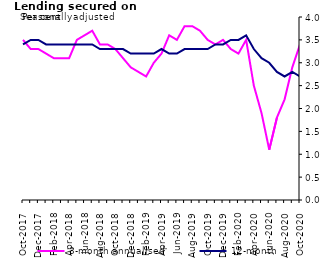
| Category | 3-month annualised | 12-month |
|---|---|---|
| Oct-2017 | 3.5 | 3.4 |
| Nov-2017 | 3.3 | 3.5 |
| Dec-2017 | 3.3 | 3.5 |
| Jan-2018 | 3.2 | 3.4 |
| Feb-2018 | 3.1 | 3.4 |
| Mar-2018 | 3.1 | 3.4 |
| Apr-2018 | 3.1 | 3.4 |
| May-2018 | 3.5 | 3.4 |
| Jun-2018 | 3.6 | 3.4 |
| Jul-2018 | 3.7 | 3.4 |
| Aug-2018 | 3.4 | 3.3 |
| Sep-2018 | 3.4 | 3.3 |
| Oct-2018 | 3.3 | 3.3 |
| Nov-2018 | 3.1 | 3.3 |
| Dec-2018 | 2.9 | 3.2 |
| Jan-2019 | 2.8 | 3.2 |
| Feb-2019 | 2.7 | 3.2 |
| Mar-2019 | 3 | 3.2 |
| Apr-2019 | 3.2 | 3.3 |
| May-2019 | 3.6 | 3.2 |
| Jun-2019 | 3.5 | 3.2 |
| Jul-2019 | 3.8 | 3.3 |
| Aug-2019 | 3.8 | 3.3 |
| Sep-2019 | 3.7 | 3.3 |
| Oct-2019 | 3.5 | 3.3 |
| Nov-2019 | 3.4 | 3.4 |
| Dec-2019 | 3.5 | 3.4 |
| Jan-2020 | 3.3 | 3.5 |
| Feb-2020 | 3.2 | 3.5 |
| Mar-2020 | 3.5 | 3.6 |
| Apr-2020 | 2.5 | 3.3 |
| May-2020 | 1.9 | 3.1 |
| Jun-2020 | 1.1 | 3 |
| Jul-2020 | 1.8 | 2.8 |
| Aug-2020 | 2.2 | 2.7 |
| Sep-2020 | 2.9 | 2.8 |
| Oct-2020 | 3.4 | 2.7 |